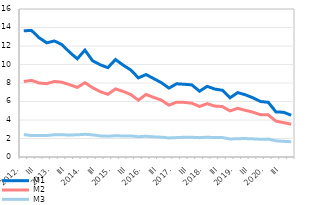
| Category | M1 | M2 | M3 |
|---|---|---|---|
| 2012. | 13.639 | 8.164 | 2.423 |
| II | 13.689 | 8.283 | 2.318 |
| III | 12.893 | 8.004 | 2.327 |
| IV | 12.342 | 7.926 | 2.321 |
| 2013. | 12.547 | 8.164 | 2.409 |
| II | 12.14 | 8.086 | 2.399 |
| III | 11.324 | 7.815 | 2.38 |
| IV | 10.614 | 7.526 | 2.4 |
| 2014. | 11.557 | 8.031 | 2.452 |
| II | 10.403 | 7.493 | 2.391 |
| III | 9.972 | 7.067 | 2.282 |
| IV | 9.656 | 6.777 | 2.251 |
| 2015. | 10.539 | 7.363 | 2.3 |
| II | 9.933 | 7.097 | 2.275 |
| III | 9.408 | 6.752 | 2.281 |
| IV | 8.554 | 6.143 | 2.191 |
| 2016. | 8.914 | 6.764 | 2.241 |
| II | 8.476 | 6.441 | 2.181 |
| III | 8.039 | 6.151 | 2.143 |
| IV | 7.449 | 5.602 | 2.061 |
| 2017. | 7.914 | 5.927 | 2.098 |
| II | 7.864 | 5.906 | 2.134 |
| III | 7.796 | 5.812 | 2.131 |
| IV | 7.109 | 5.459 | 2.092 |
| 2018. | 7.639 | 5.765 | 2.144 |
| II | 7.345 | 5.506 | 2.096 |
| III | 7.214 | 5.455 | 2.097 |
| IV | 6.403 | 4.984 | 1.947 |
| 2019. | 6.962 | 5.26 | 1.981 |
| II | 6.724 | 5.045 | 1.993 |
| III | 6.399 | 4.846 | 1.962 |
| IV | 5.996 | 4.566 | 1.919 |
| 2020. | 5.913 | 4.555 | 1.934 |
| II | 4.878 | 3.878 | 1.753 |
| III | 4.836 | 3.717 | 1.696 |
| IV | 4.517 | 3.547 | 1.653 |